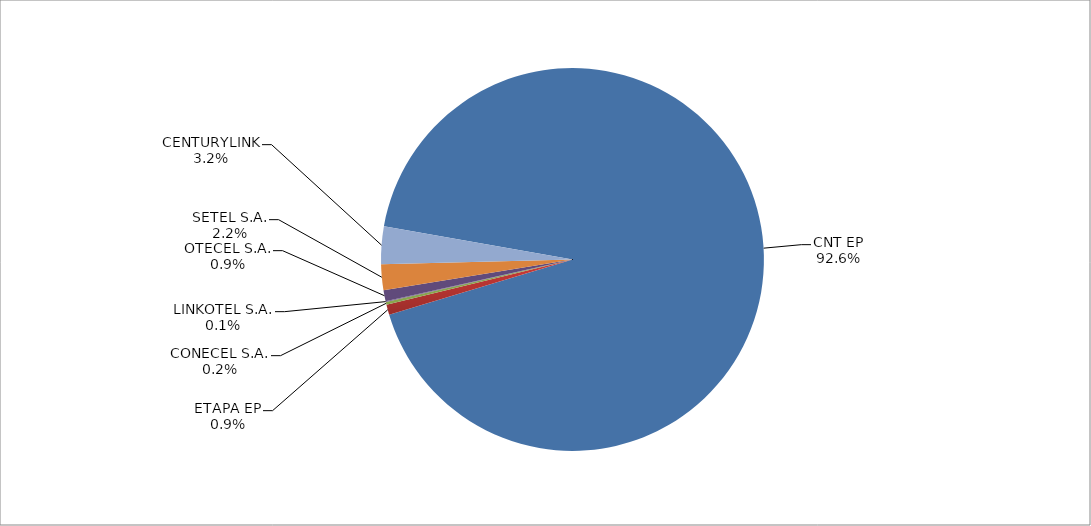
| Category | Series 0 |
|---|---|
| CNT EP | 2774 |
| ETAPA EP | 26 |
| CONECEL S.A. | 7 |
| LINKOTEL S.A. | 2 |
| OTECEL S.A. | 28 |
| SETEL S.A. | 65 |
| CENTURYLINK | 95 |